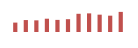
| Category | Importações (2) |
|---|---|
| 0 | 62681.056 |
| 1 | 79621.593 |
| 2 | 77709.867 |
| 3 | 88593.929 |
| 4 | 80744.22 |
| 5 | 85348.563 |
| 6 | 121368.935 |
| 7 | 124143.971 |
| 8 | 115571.707 |
| 9 | 108842.355 |
| 10 | 134086.476 |